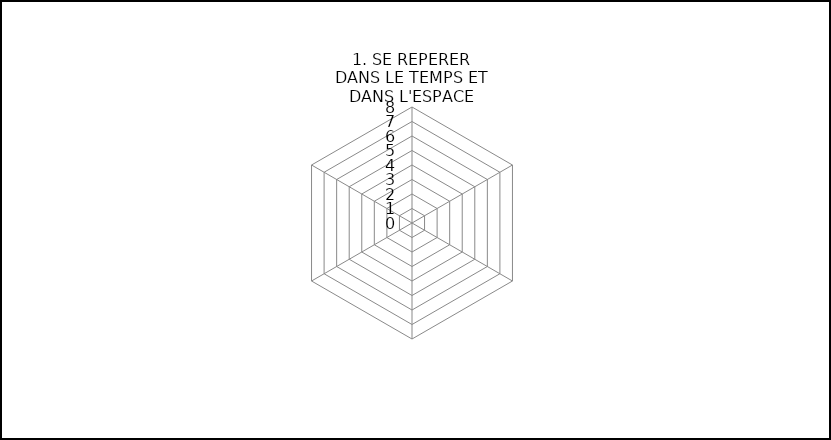
| Category | Series 1 |
|---|---|
| 1. SE REPERER DANS LE TEMPS ET DANS L'ESPACE | 0 |
| 2. METTRE EN ŒUVRE DES DEMARCHES ET DES CONNAISSANCES | 0 |
| 3. EXPLOITER DES DOCUMENTS | 0 |
| 4. UTILISER DES OUTILS ET METHODES | 0 |
| 5. S'INFORMER ET FAIRE PREUVE D'ESPRIT CRITIQUE | 0 |
| 6. COOPERER, MUTUALISER | 0 |